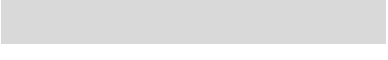
| Category | #REF! |
|---|---|
| 0.0 | 0 |
| 0.0 | 0 |
| 0.0 | 0 |
| 0.0 | 0 |
| 0.0 | 0 |
| 0.0 | 0 |
| 0.0 | 0 |
| 0.0 | 0 |
| 0.0 | 0 |
| 0.0 | 0 |
| 0.0 | 0 |
| 0.0 | 0 |
| 0.0 | 0 |
| 0.0 | 0 |
| 0.0 | 0 |
| 0.0 | 0 |
| 0.0 | 0 |
| 0.0 | 0 |
| 0.0 | 0 |
| 0.0 | 0 |
| 0.0 | 0 |
| 0.0 | 0 |
| 0.0 | 0 |
| 0.0 | 0 |
| 0.0 | 0 |
| 0.0 | 0 |
| 0.0 | 0 |
| 0.0 | 0 |
| 0.0 | 0 |
| 0.0 | 0 |
| 0.0 | 0 |
| 0.0 | 0 |
| 0.0 | 0 |
| 0.0 | 0 |
| 0.0 | 0 |
| 0.0 | 0 |
| 0.0 | 0 |
| 0.0 | 0 |
| 0.0 | 0 |
| 0.0 | 0 |
| 0.0 | 0 |
| 0.0 | 0 |
| 0.0 | 0 |
| 0.0 | 0 |